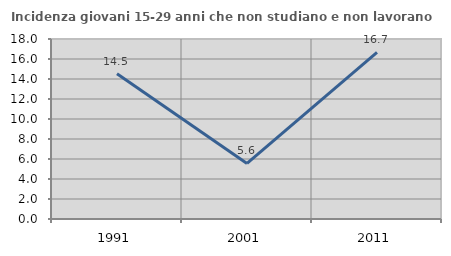
| Category | Incidenza giovani 15-29 anni che non studiano e non lavorano  |
|---|---|
| 1991.0 | 14.526 |
| 2001.0 | 5.556 |
| 2011.0 | 16.667 |